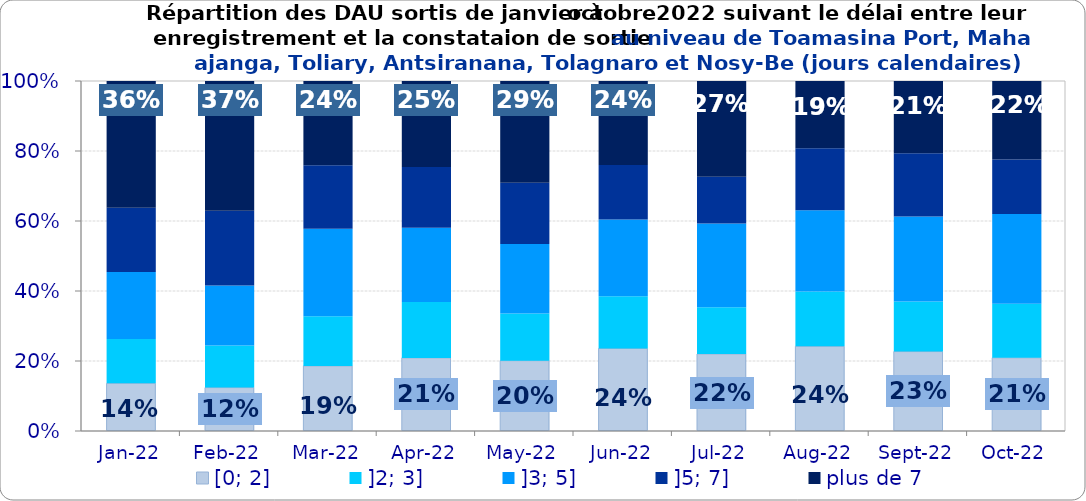
| Category | [0; 2] | ]2; 3] | ]3; 5] | ]5; 7] | plus de 7 |
|---|---|---|---|---|---|
| 2022-01-01 | 0.136 | 0.127 | 0.191 | 0.184 | 0.362 |
| 2022-02-01 | 0.124 | 0.12 | 0.172 | 0.213 | 0.371 |
| 2022-03-01 | 0.186 | 0.142 | 0.25 | 0.182 | 0.241 |
| 2022-04-01 | 0.209 | 0.16 | 0.212 | 0.173 | 0.246 |
| 2022-05-01 | 0.201 | 0.135 | 0.199 | 0.175 | 0.29 |
| 2022-06-01 | 0.236 | 0.149 | 0.219 | 0.156 | 0.24 |
| 2022-07-01 | 0.22 | 0.134 | 0.239 | 0.133 | 0.274 |
| 2022-08-01 | 0.242 | 0.157 | 0.232 | 0.177 | 0.192 |
| 2022-09-01 | 0.227 | 0.143 | 0.243 | 0.181 | 0.206 |
| 2022-10-01 | 0.209 | 0.154 | 0.257 | 0.156 | 0.224 |